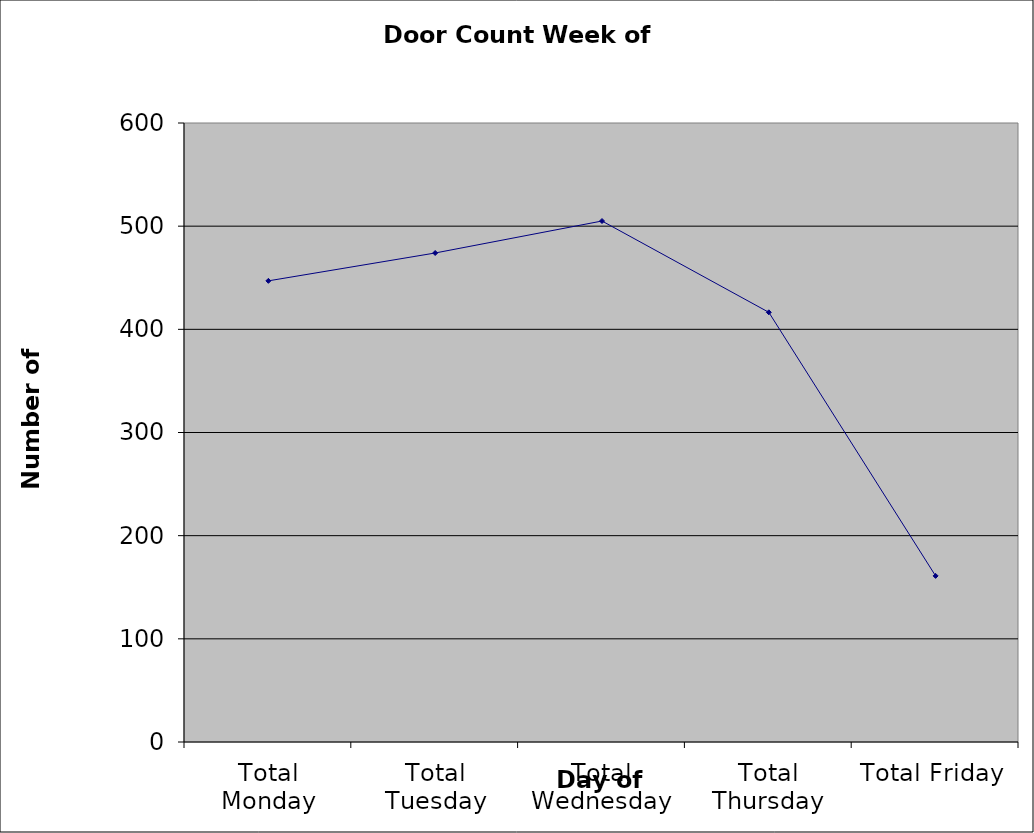
| Category | Series 0 |
|---|---|
| Total Monday | 447 |
| Total Tuesday | 474 |
| Total Wednesday | 505 |
| Total Thursday | 416.5 |
| Total Friday | 161 |